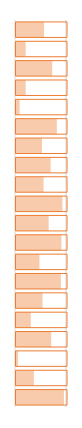
| Category | % Done | Dummy |
|---|---|---|
| Project 1 | 0.55 | 1 |
| Project 2 | 0.19 | 1 |
| Project 3 | 0.71 | 1 |
| Project 4 | 0.19 | 1 |
| Project 5 | 0.07 | 1 |
| Project 6 | 0.8 | 1 |
| Project 7 | 0.51 | 1 |
| Project 8 | 0.68 | 1 |
| Project 9 | 0.54 | 1 |
| Project 10 | 0.91 | 1 |
| Project 11 | 0.64 | 1 |
| Project 12 | 0.89 | 1 |
| Project 13 | 0.46 | 1 |
| Project 14 | 0.88 | 1 |
| Project 15 | 0.52 | 1 |
| Project 16 | 0.29 | 1 |
| Project 17 | 0.69 | 1 |
| Project 18 | 0.04 | 1 |
| Project 19 | 0.35 | 1 |
| Project 20 | 0.94 | 1 |